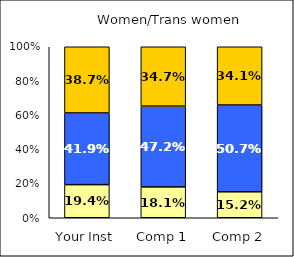
| Category | Low Career Related Stress | Average Career Related Stress | High Career Related Stress |
|---|---|---|---|
| Your Inst | 0.194 | 0.419 | 0.387 |
| Comp 1 | 0.181 | 0.472 | 0.347 |
| Comp 2 | 0.152 | 0.507 | 0.341 |